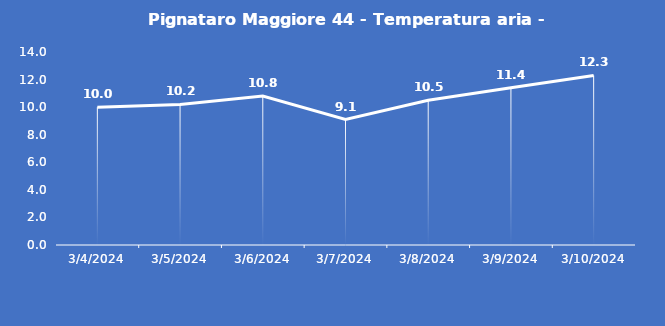
| Category | Pignataro Maggiore 44 - Temperatura aria - Grezzo (°C) |
|---|---|
| 3/4/24 | 10 |
| 3/5/24 | 10.2 |
| 3/6/24 | 10.8 |
| 3/7/24 | 9.1 |
| 3/8/24 | 10.5 |
| 3/9/24 | 11.4 |
| 3/10/24 | 12.3 |